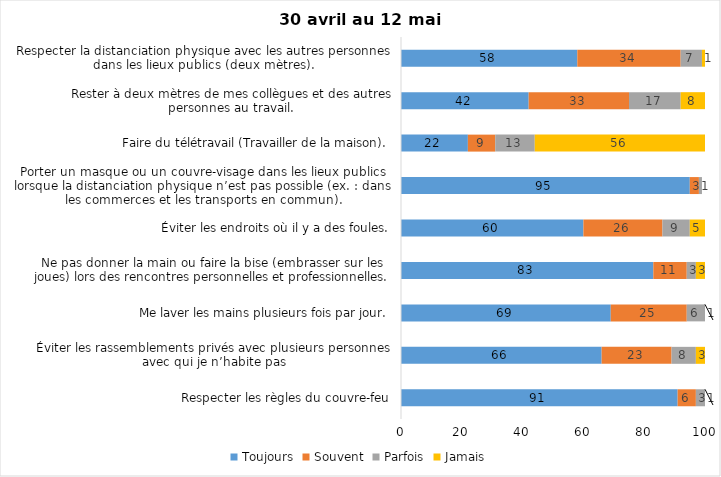
| Category | Toujours | Souvent | Parfois | Jamais |
|---|---|---|---|---|
| Respecter les règles du couvre-feu | 91 | 6 | 3 | 1 |
| Éviter les rassemblements privés avec plusieurs personnes avec qui je n’habite pas | 66 | 23 | 8 | 3 |
| Me laver les mains plusieurs fois par jour. | 69 | 25 | 6 | 1 |
| Ne pas donner la main ou faire la bise (embrasser sur les joues) lors des rencontres personnelles et professionnelles. | 83 | 11 | 3 | 3 |
| Éviter les endroits où il y a des foules. | 60 | 26 | 9 | 5 |
| Porter un masque ou un couvre-visage dans les lieux publics lorsque la distanciation physique n’est pas possible (ex. : dans les commerces et les transports en commun). | 95 | 3 | 1 | 0 |
| Faire du télétravail (Travailler de la maison). | 22 | 9 | 13 | 56 |
| Rester à deux mètres de mes collègues et des autres personnes au travail. | 42 | 33 | 17 | 8 |
| Respecter la distanciation physique avec les autres personnes dans les lieux publics (deux mètres). | 58 | 34 | 7 | 1 |